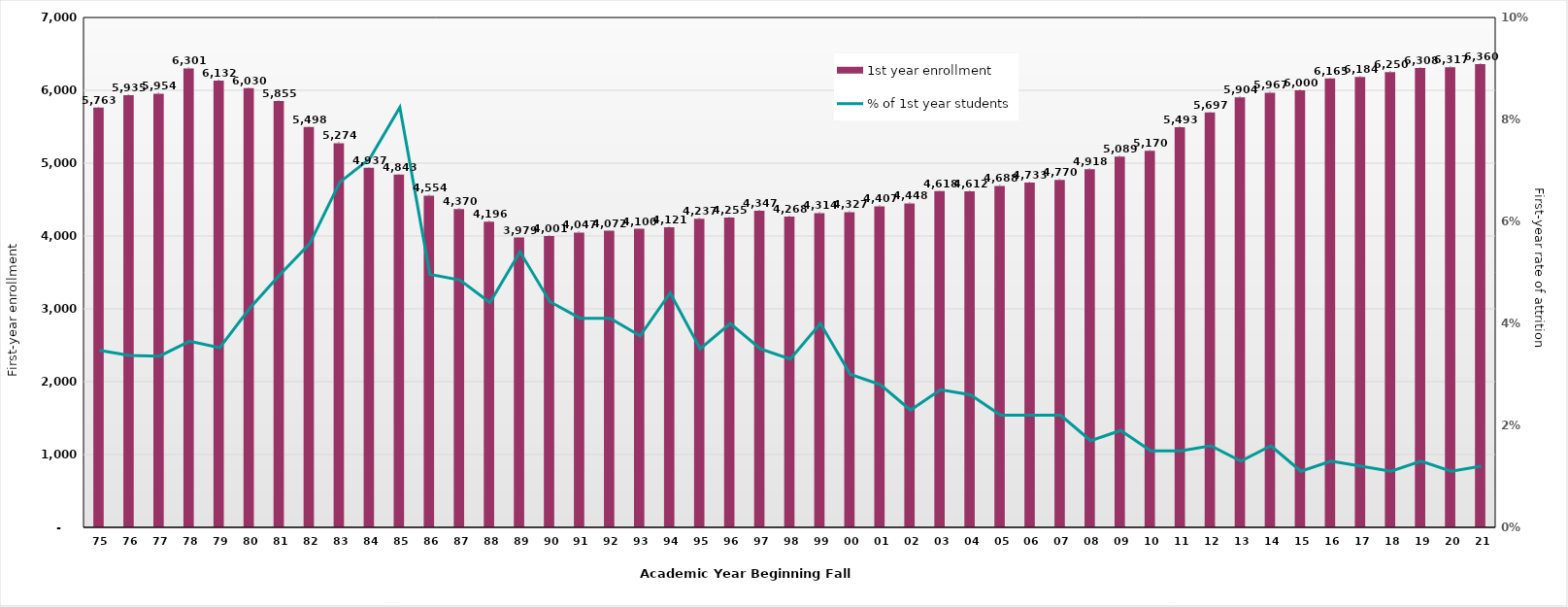
| Category | 1st year enrollment |
|---|---|
| 75 | 5763 |
| 76 | 5935 |
| 77 | 5954 |
| 78 | 6301 |
| 79 | 6132 |
| 80 | 6030 |
| 81 | 5855 |
| 82 | 5498 |
| 83 | 5274 |
| 84 | 4937 |
| 85 | 4843 |
| 86 | 4554 |
| 87 | 4370 |
| 88 | 4196 |
| 89 | 3979 |
| 90 | 4001 |
| 91 | 4047 |
| 92 | 4072 |
| 93 | 4100 |
| 94 | 4121 |
| 95 | 4237 |
| 96 | 4255 |
| 97 | 4347 |
| 98 | 4268 |
| 99 | 4314 |
| 00 | 4327 |
| 01 | 4407 |
| 02 | 4448 |
| 03 | 4618 |
| 04 | 4612 |
| 05 | 4688 |
| 06 | 4733 |
| 07 | 4770 |
| 08 | 4918 |
| 09 | 5089 |
| 10 | 5170 |
| 11 | 5493 |
| 12 | 5697 |
| 13 | 5904 |
| 14 | 5967 |
| 15 | 6000 |
| 16 | 6165 |
| 17 | 6184 |
| 18 | 6250 |
| 19 | 6308 |
| 20 | 6317 |
| 21 | 6360 |